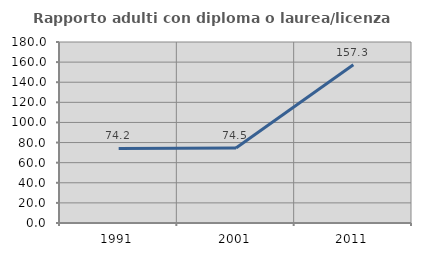
| Category | Rapporto adulti con diploma o laurea/licenza media  |
|---|---|
| 1991.0 | 74.182 |
| 2001.0 | 74.541 |
| 2011.0 | 157.288 |